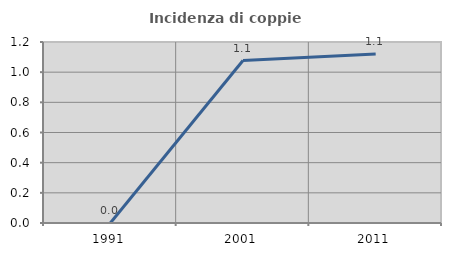
| Category | Incidenza di coppie miste |
|---|---|
| 1991.0 | 0 |
| 2001.0 | 1.077 |
| 2011.0 | 1.12 |